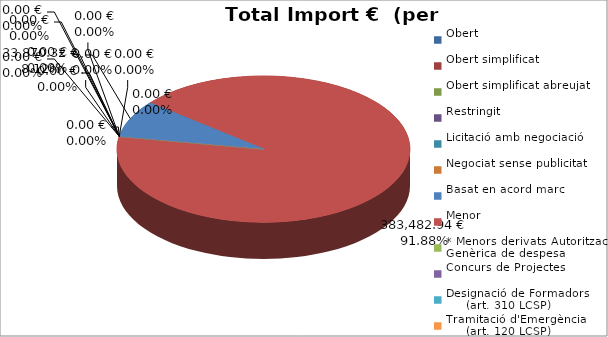
| Category | Total preu
(amb IVA) |
|---|---|
| Obert | 0 |
| Obert simplificat | 0 |
| Obert simplificat abreujat | 0 |
| Restringit | 0 |
| Licitació amb negociació | 0 |
| Negociat sense publicitat | 0 |
| Basat en acord marc | 33870.32 |
| Menor | 383482.94 |
| * Menors derivats Autorització Genèrica de despesa | 0 |
| Concurs de Projectes | 0 |
| Designació de Formadors
     (art. 310 LCSP) | 0 |
| Tramitació d'Emergència
     (art. 120 LCSP) | 0 |